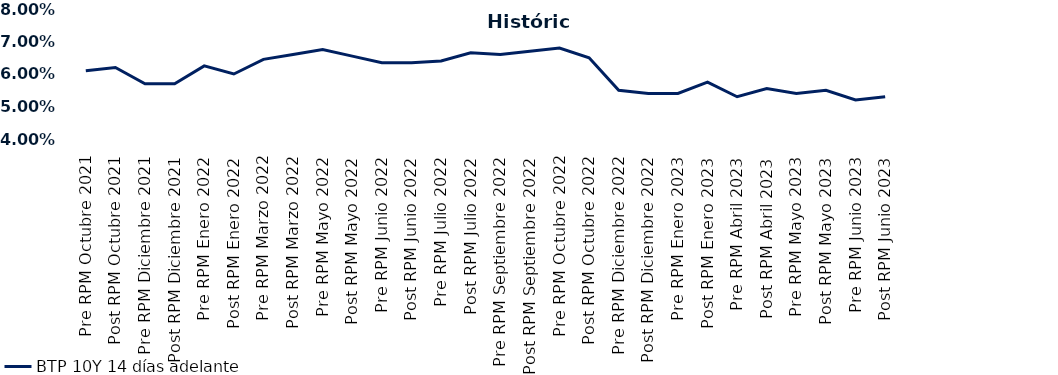
| Category | BTP 10Y 14 días adelante |
|---|---|
| Pre RPM Octubre 2021 | 0.061 |
| Post RPM Octubre 2021 | 0.062 |
| Pre RPM Diciembre 2021 | 0.057 |
| Post RPM Diciembre 2021 | 0.057 |
| Pre RPM Enero 2022 | 0.062 |
| Post RPM Enero 2022 | 0.06 |
| Pre RPM Marzo 2022 | 0.064 |
| Post RPM Marzo 2022 | 0.066 |
| Pre RPM Mayo 2022 | 0.068 |
| Post RPM Mayo 2022 | 0.066 |
| Pre RPM Junio 2022 | 0.064 |
| Post RPM Junio 2022 | 0.064 |
| Pre RPM Julio 2022 | 0.064 |
| Post RPM Julio 2022 | 0.066 |
| Pre RPM Septiembre 2022 | 0.066 |
| Post RPM Septiembre 2022 | 0.067 |
| Pre RPM Octubre 2022 | 0.068 |
| Post RPM Octubre 2022 | 0.065 |
| Pre RPM Diciembre 2022 | 0.055 |
| Post RPM Diciembre 2022 | 0.054 |
| Pre RPM Enero 2023 | 0.054 |
| Post RPM Enero 2023 | 0.058 |
| Pre RPM Abril 2023 | 0.053 |
| Post RPM Abril 2023 | 0.056 |
| Pre RPM Mayo 2023 | 0.054 |
| Post RPM Mayo 2023 | 0.055 |
| Pre RPM Junio 2023 | 0.052 |
| Post RPM Junio 2023 | 0.053 |